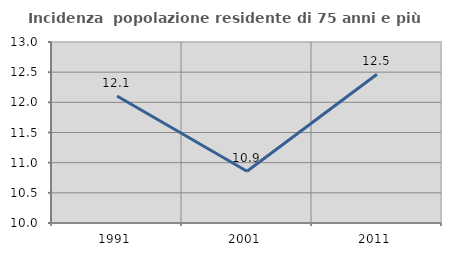
| Category | Incidenza  popolazione residente di 75 anni e più |
|---|---|
| 1991.0 | 12.105 |
| 2001.0 | 10.859 |
| 2011.0 | 12.466 |